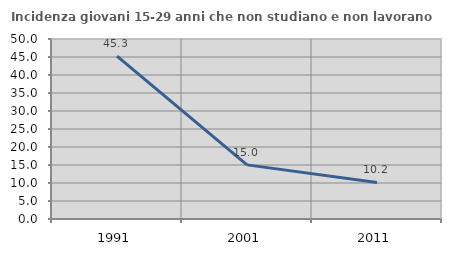
| Category | Incidenza giovani 15-29 anni che non studiano e non lavorano  |
|---|---|
| 1991.0 | 45.255 |
| 2001.0 | 15.038 |
| 2011.0 | 10.156 |